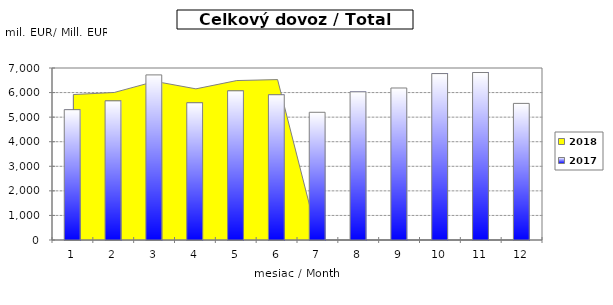
| Category | 2017 |
|---|---|
| 0 | 5304.07 |
| 1 | 5663.251 |
| 2 | 6718.938 |
| 3 | 5585.524 |
| 4 | 6071.337 |
| 5 | 5911.917 |
| 6 | 5197.371 |
| 7 | 6030.745 |
| 8 | 6186.419 |
| 9 | 6772.372 |
| 10 | 6815.617 |
| 11 | 5559.646 |